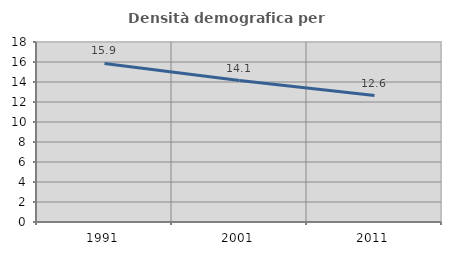
| Category | Densità demografica |
|---|---|
| 1991.0 | 15.861 |
| 2001.0 | 14.14 |
| 2011.0 | 12.644 |